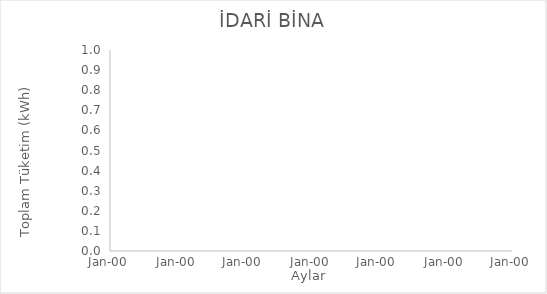
| Category | toplam 
(kWh) |
|---|---|
|  | 0 |
|  | 0 |
|  | 0 |
|  | 0 |
|  | 0 |
|  | 0 |
|  | 0 |
|  | 0 |
|  | 0 |
|  | 0 |
|  | 0 |
|  | 0 |
|  | 0 |
|  | 0 |